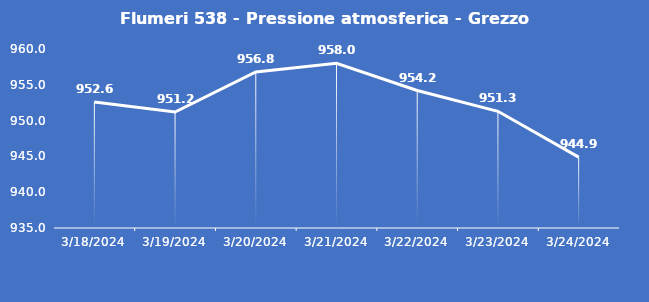
| Category | Flumeri 538 - Pressione atmosferica - Grezzo (hPa) |
|---|---|
| 3/18/24 | 952.6 |
| 3/19/24 | 951.2 |
| 3/20/24 | 956.8 |
| 3/21/24 | 958 |
| 3/22/24 | 954.2 |
| 3/23/24 | 951.3 |
| 3/24/24 | 944.9 |